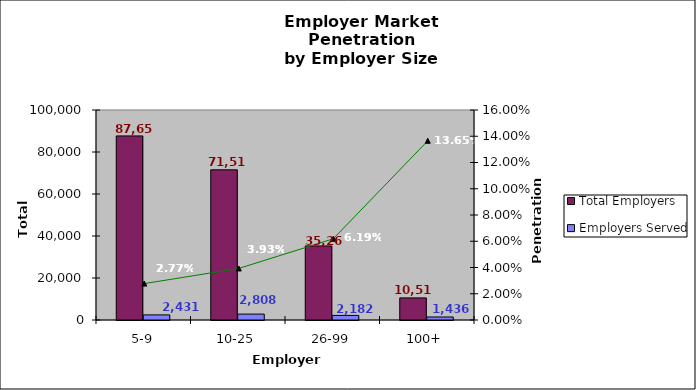
| Category | Total Employers | Employers Served |
|---|---|---|
| 5-9 | 87651 | 2431 |
| 10-25 | 71514 | 2808 |
| 26-99 | 35264 | 2182 |
| 100+ | 10518 | 1436 |